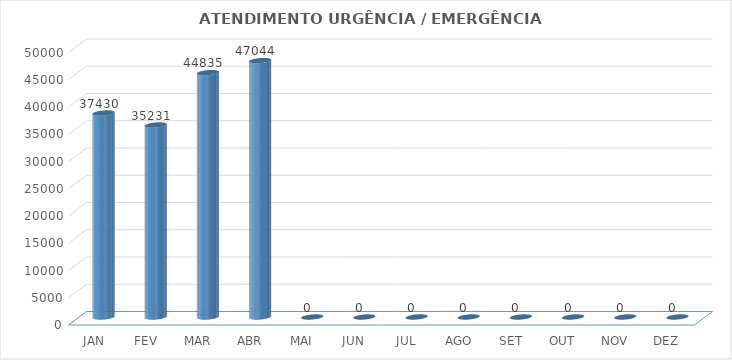
| Category | Series 0 |
|---|---|
| JAN | 37430 |
| FEV | 35231 |
| MAR | 44835 |
| ABR | 47044 |
| MAI | 0 |
| JUN | 0 |
| JUL | 0 |
| AGO | 0 |
| SET | 0 |
| OUT | 0 |
| NOV | 0 |
| DEZ | 0 |